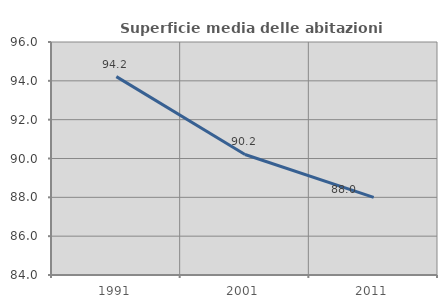
| Category | Superficie media delle abitazioni occupate |
|---|---|
| 1991.0 | 94.218 |
| 2001.0 | 90.208 |
| 2011.0 | 88 |